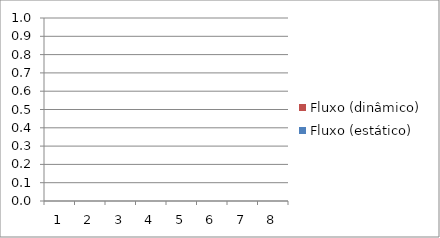
| Category | Fluxo (dinâmico) | Fluxo (estático) |
|---|---|---|
| 1.0 | 0 | 0 |
| 2.0 | 0 | 0 |
| 3.0 | 0 | 0 |
| 4.0 | 0 | 0 |
| 5.0 | 0 | 0 |
| 6.0 | 0 | 0 |
| 7.0 | 0 | 0 |
| 8.0 | 0 | 0 |